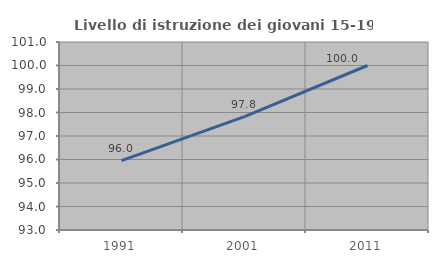
| Category | Livello di istruzione dei giovani 15-19 anni |
|---|---|
| 1991.0 | 95.954 |
| 2001.0 | 97.826 |
| 2011.0 | 100 |